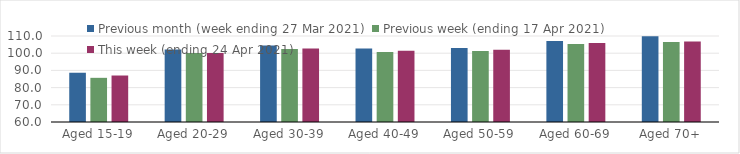
| Category | Previous month (week ending 27 Mar 2021) | Previous week (ending 17 Apr 2021) | This week (ending 24 Apr 2021) |
|---|---|---|---|
| Aged 15-19 | 88.64 | 85.68 | 87.03 |
| Aged 20-29 | 102.16 | 100.13 | 100.05 |
| Aged 30-39 | 104.43 | 102.43 | 102.78 |
| Aged 40-49 | 102.67 | 100.63 | 101.4 |
| Aged 50-59 | 103.02 | 101.28 | 101.98 |
| Aged 60-69 | 107.04 | 105.4 | 105.96 |
| Aged 70+ | 109.86 | 106.52 | 106.8 |